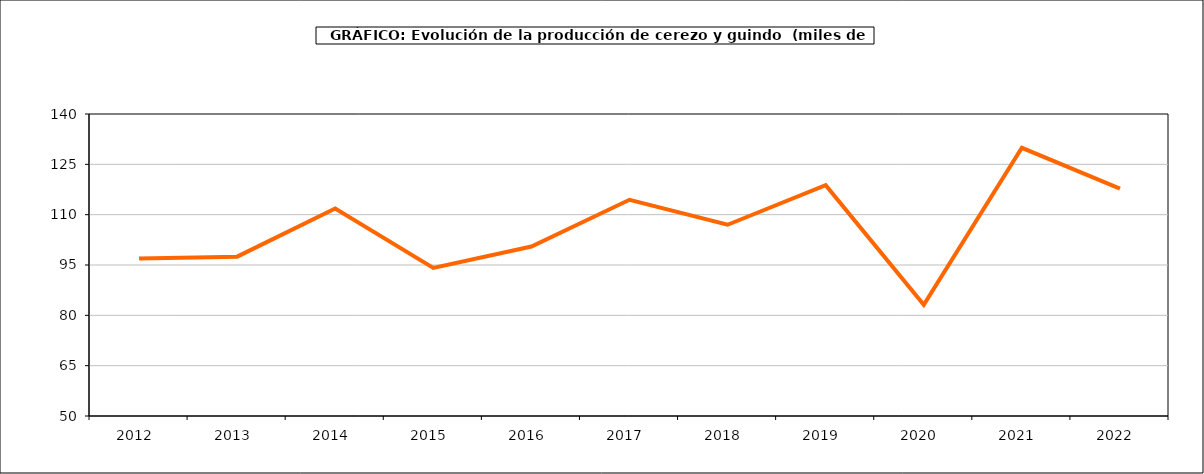
| Category | producción cerezo y guindo |
|---|---|
| 2012.0 | 96.946 |
| 2013.0 | 97.489 |
| 2014.0 | 111.821 |
| 2015.0 | 94.143 |
| 2016.0 | 100.503 |
| 2017.0 | 114.433 |
| 2018.0 | 107 |
| 2019.0 | 118.762 |
| 2020.0 | 83.118 |
| 2021.0 | 129.933 |
| 2022.0 | 117.782 |